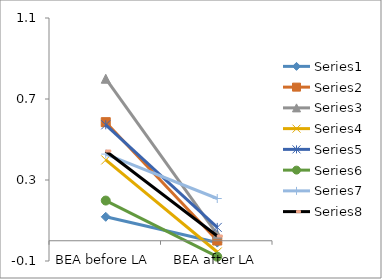
| Category | Series 0 | Series 1 | Series 2 | Series 3 | Series 4 | Series 5 | Series 6 | Series 7 |
|---|---|---|---|---|---|---|---|---|
| BEA before LA | 0.118 | 0.586 | 0.8 | 0.399 | 0.572 | 0.198 | 0.428 | 0.443 |
| BEA after LA | -0.009 | 0.001 | 0.032 | -0.055 | 0.066 | -0.079 | 0.209 | 0.023 |